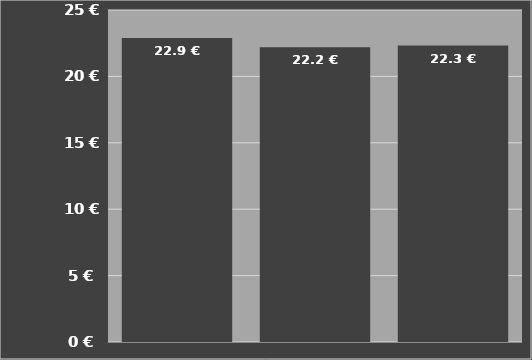
| Category | Kosten je Hektar
inklusive Schlepper |
|---|---|
| Seco Duplex
650 F Front | 22.899 |
| Seco Duplex
800 F Front | 22.197 |
| Seco Duplex
950 F Front | 22.321 |